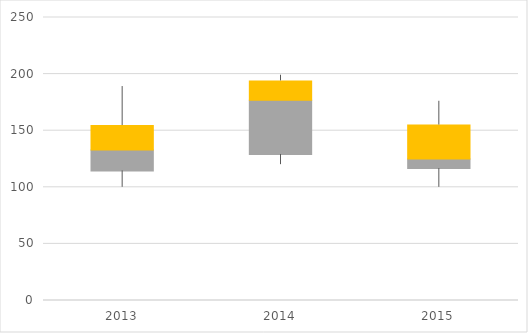
| Category | Series 0 | Series 1 | Series 2 | Series 3 | Series 4 |
|---|---|---|---|---|---|
| 2013.0 | 100 | 14.5 | 18.5 | 21.5 | 34.5 |
| 2014.0 | 120 | 9 | 48 | 17 | 5 |
| 2015.0 | 100 | 16.5 | 8.5 | 30 | 21 |